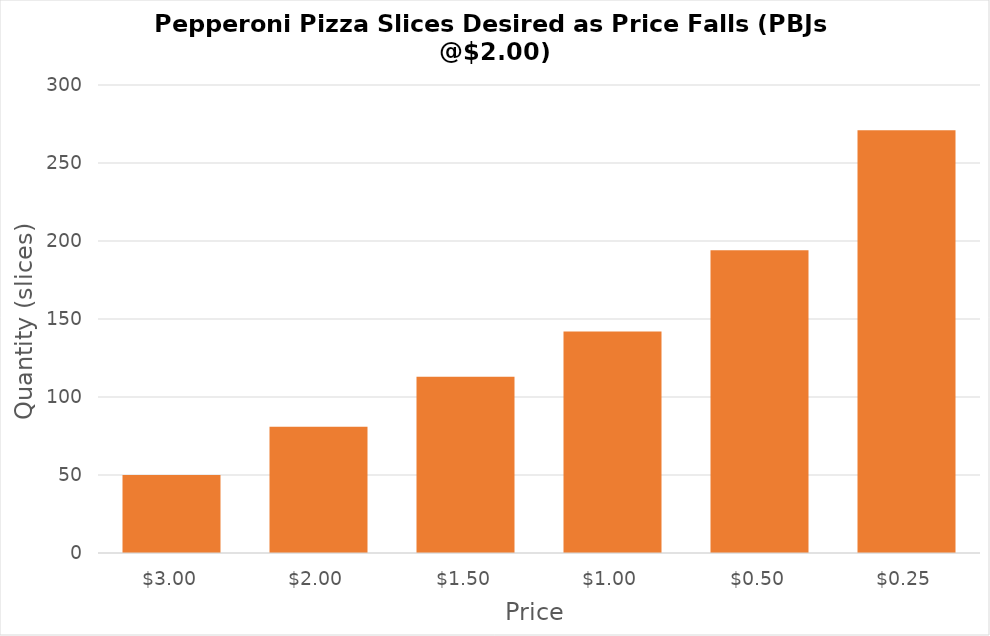
| Category | Quantity |
|---|---|
| 3.0 | 50 |
| 2.0 | 81 |
| 1.5 | 113 |
| 1.0 | 142 |
| 0.5 | 194 |
| 0.25 | 271 |